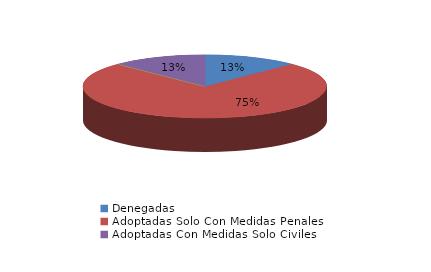
| Category | Series 0 |
|---|---|
| Denegadas | 1 |
| Adoptadas Solo Con Medidas Penales | 6 |
| Adoptadas Con Medidas Civiles Y Penales | 0 |
| Adoptadas Con Medidas Solo Civiles | 1 |